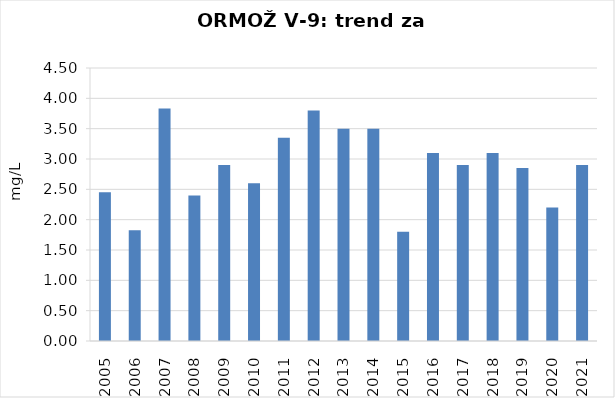
| Category | Vsota |
|---|---|
| 2005 | 2.45 |
| 2006 | 1.825 |
| 2007 | 3.833 |
| 2008 | 2.4 |
| 2009 | 2.9 |
| 2010 | 2.6 |
| 2011 | 3.35 |
| 2012 | 3.8 |
| 2013 | 3.5 |
| 2014 | 3.5 |
| 2015 | 1.8 |
| 2016 | 3.1 |
| 2017 | 2.9 |
| 2018 | 3.1 |
| 2019 | 2.85 |
| 2020 | 2.2 |
| 2021 | 2.9 |